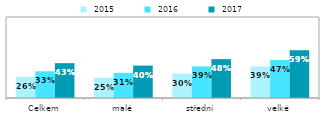
| Category |  2015 |  2016 |  2017 |
|---|---|---|---|
| Celkem | 0.26 | 0.33 | 0.43 |
| malé | 0.25 | 0.31 | 0.4 |
| střední | 0.3 | 0.39 | 0.48 |
| velké | 0.39 | 0.47 | 0.59 |